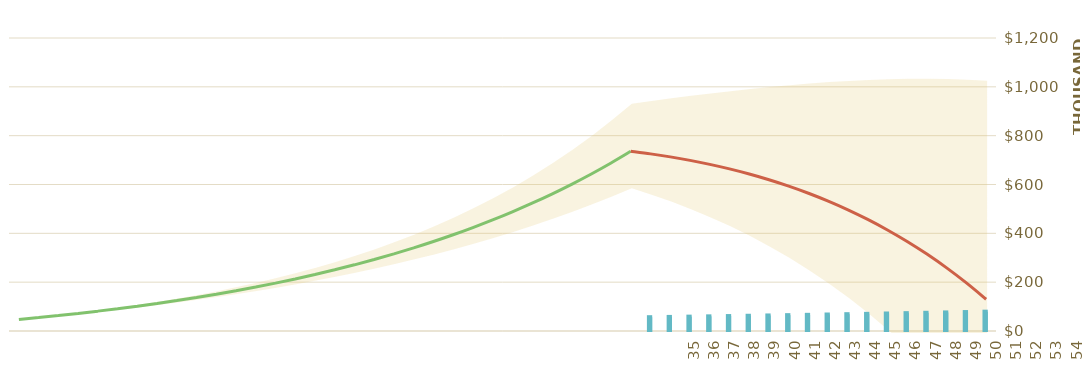
| Category | Desired Retirement Income |
|---|---|
| 0 | 0 |
| 1 | 0 |
| 2 | 0 |
| 3 | 0 |
| 4 | 0 |
| 5 | 0 |
| 6 | 0 |
| 7 | 0 |
| 8 | 0 |
| 9 | 0 |
| 10 | 0 |
| 11 | 0 |
| 12 | 0 |
| 13 | 0 |
| 14 | 0 |
| 15 | 0 |
| 16 | 0 |
| 17 | 0 |
| 18 | 0 |
| 19 | 0 |
| 20 | 0 |
| 21 | 0 |
| 22 | 0 |
| 23 | 0 |
| 24 | 0 |
| 25 | 0 |
| 26 | 0 |
| 27 | 0 |
| 28 | 0 |
| 29 | 0 |
| 30 | 0 |
| 31 | 0 |
| 32 | 56536.218 |
| 33 | 57666.942 |
| 34 | 58820.281 |
| 35 | 59996.687 |
| 36 | 61196.62 |
| 37 | 62420.553 |
| 38 | 63668.964 |
| 39 | 64942.343 |
| 40 | 66241.19 |
| 41 | 67566.014 |
| 42 | 68917.334 |
| 43 | 70295.681 |
| 44 | 71701.594 |
| 45 | 73135.626 |
| 46 | 74598.339 |
| 47 | 76090.305 |
| 48 | 77612.112 |
| 49 | 79164.354 |